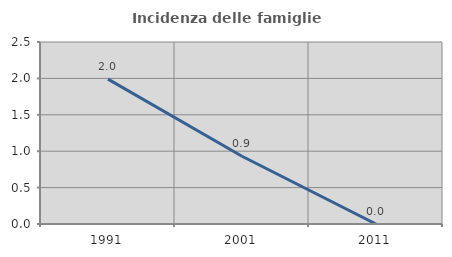
| Category | Incidenza delle famiglie numerose |
|---|---|
| 1991.0 | 1.99 |
| 2001.0 | 0.93 |
| 2011.0 | 0 |